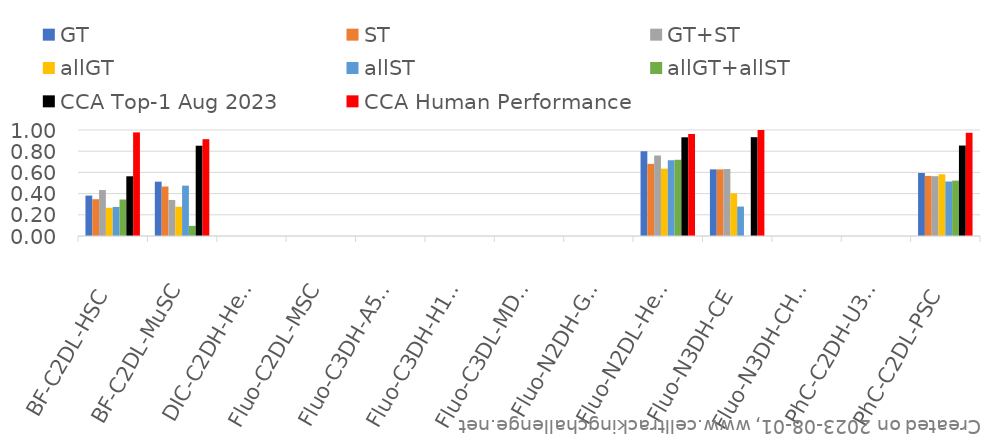
| Category | GT | ST | GT+ST | allGT | allST | allGT+allST | CCA Top-1 Aug 2023 | CCA Human Performance |
|---|---|---|---|---|---|---|---|---|
| BF-C2DL-HSC | 0.381 | 0.347 | 0.433 | 0.266 | 0.274 | 0.344 | 0.563 | 0.977 |
| BF-C2DL-MuSC | 0.513 | 0.467 | 0.34 | 0.276 | 0.475 | 0.095 | 0.852 | 0.913 |
| DIC-C2DH-HeLa | 0 | 0 | 0 | 0 | 0 | 0 | 0 | 0 |
| Fluo-C2DL-MSC | 0 | 0 | 0 | 0 | 0 | 0 | 0 | 0 |
| Fluo-C3DH-A549 | 0 | 0 | 0 | 0 | 0 | 0 | 0 | 0 |
| Fluo-C3DH-H157 | 0 | 0 | 0 | 0 | 0 | 0 | 0 | 0 |
| Fluo-C3DL-MDA231 | 0 | 0 | 0 | 0 | 0 | 0 | 0 | 0 |
| Fluo-N2DH-GOWT1 | 0 | 0 | 0 | 0 | 0 | 0 | 0 | 0 |
| Fluo-N2DL-HeLa | 0.8 | 0.68 | 0.759 | 0.636 | 0.715 | 0.719 | 0.931 | 0.963 |
| Fluo-N3DH-CE | 0.629 | 0.628 | 0.632 | 0.402 | 0.278 | 0 | 0.932 | 1 |
| Fluo-N3DH-CHO | 0 | 0 | 0 | 0 | 0 | 0 | 0 | 0 |
| PhC-C2DH-U373 | 0 | 0 | 0 | 0 | 0 | 0 | 0 | 0 |
| PhC-C2DL-PSC | 0.595 | 0.567 | 0.564 | 0.582 | 0.514 | 0.522 | 0.853 | 0.974 |